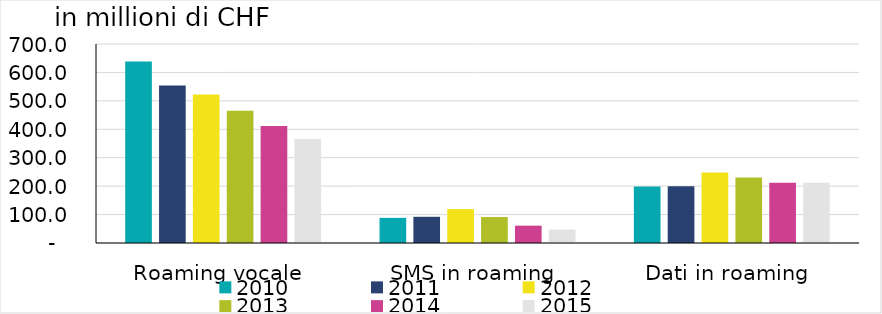
| Category | 2010 | 2011 | 2012 | 2013 | 2014 | 2015 |
|---|---|---|---|---|---|---|
| Roaming vocale | 638.374 | 553.668 | 522.689 | 464.834 | 411.566 | 365.936 |
| SMS in roaming | 88.383 | 92.169 | 119.294 | 91.344 | 61.011 | 47.347 |
| Dati in roaming | 199.16 | 199.573 | 248.416 | 230.172 | 211.707 | 211.605 |